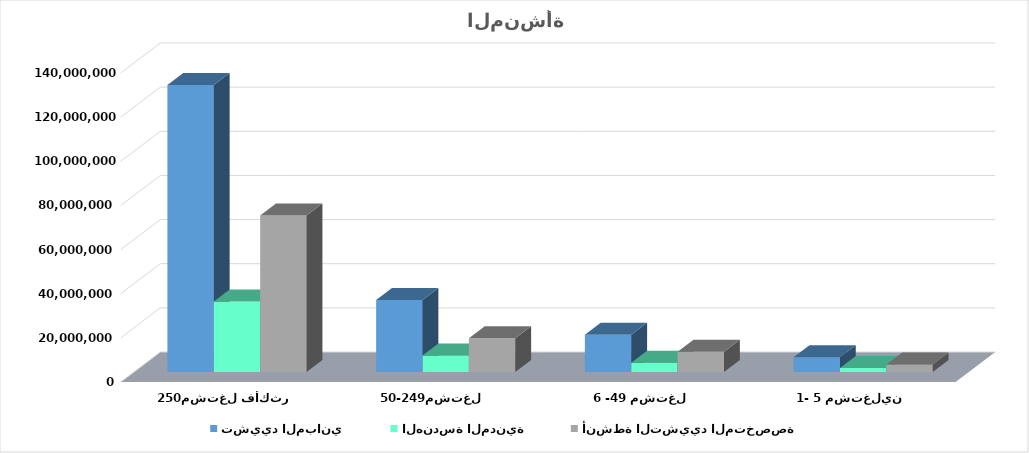
| Category | تشييد المباني | الهندسة المدنية | أنشطة التشييد المتخصصة |
|---|---|---|---|
| 1- 5 مشتغلين | 6706724.085 | 1834835.411 | 3364835.176 |
| 6 -49 مشتغل | 16874594.458 | 4207714.585 | 9164218.592 |
| 50-249مشتغل | 32592696.135 | 7436424.824 | 15277393.635 |
| 250مشتغل فأكثر | 130047179.819 | 31930201.326 | 70892839.114 |